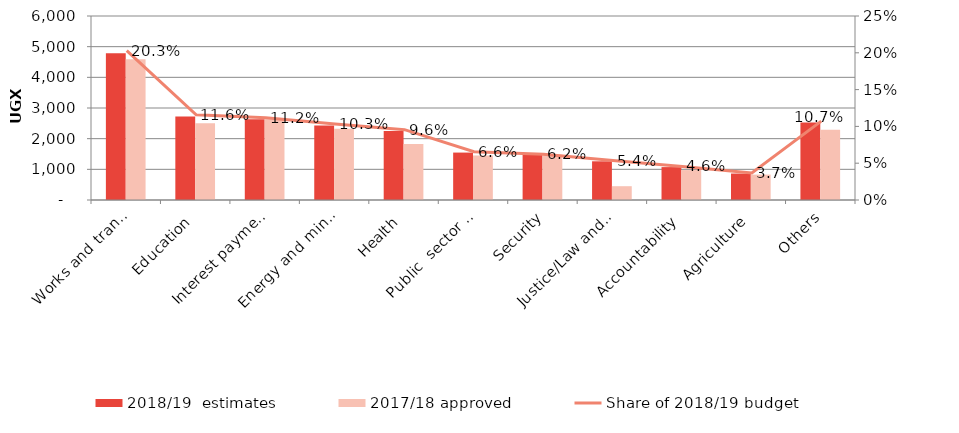
| Category | 2018/19  estimates | 2017/18 approved |
|---|---|---|
| Works and transport | 4782.42 | 4587.27 |
| Education | 2726.12 | 2501.12 |
| Interest payments | 2634.11 | 2635.4 |
| Energy and mineral development | 2428.9 | 2319.8 |
| Health | 2250.55 | 1824.08 |
| Public  sector management | 1546.5 | 1450.05 |
| Security | 1466.36 | 1472.76 |
| Justice/Law and order | 1262.13 | 450.18 |
| Accountability | 1072.69 | 976.23 |
| Agriculture | 862.92 | 828.51 |
| Others | 2524.13 | 2287.69 |